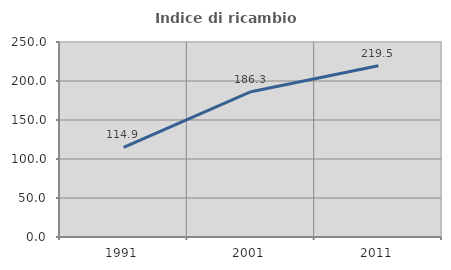
| Category | Indice di ricambio occupazionale  |
|---|---|
| 1991.0 | 114.872 |
| 2001.0 | 186.29 |
| 2011.0 | 219.451 |